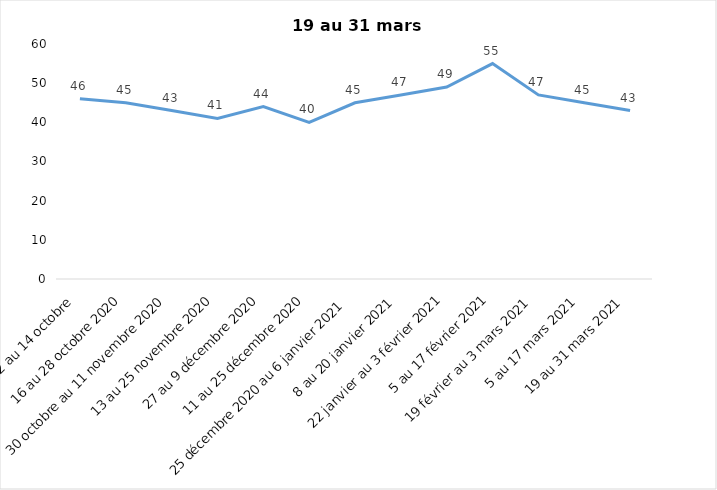
| Category | Toujours aux trois mesures |
|---|---|
| 2 au 14 octobre  | 46 |
| 16 au 28 octobre 2020 | 45 |
| 30 octobre au 11 novembre 2020 | 43 |
| 13 au 25 novembre 2020 | 41 |
| 27 au 9 décembre 2020 | 44 |
| 11 au 25 décembre 2020 | 40 |
| 25 décembre 2020 au 6 janvier 2021 | 45 |
| 8 au 20 janvier 2021 | 47 |
| 22 janvier au 3 février 2021 | 49 |
| 5 au 17 février 2021 | 55 |
| 19 février au 3 mars 2021 | 47 |
| 5 au 17 mars 2021 | 45 |
| 19 au 31 mars 2021 | 43 |